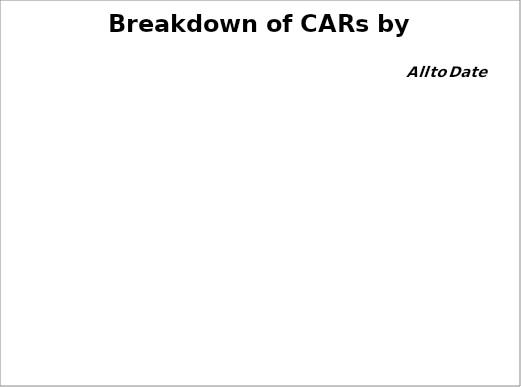
| Category | Series 0 |
|---|---|
| Corrective | 0 |
| Preventive | 0 |
| OFI | 0 |